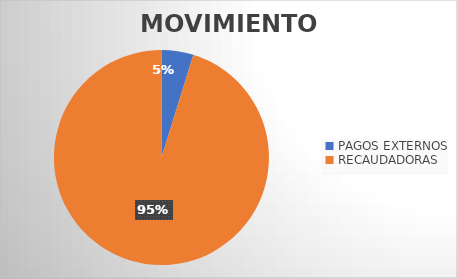
| Category | MOVIMIENTOS |
|---|---|
| PAGOS EXTERNOS | 1117 |
| RECAUDADORAS | 22200 |